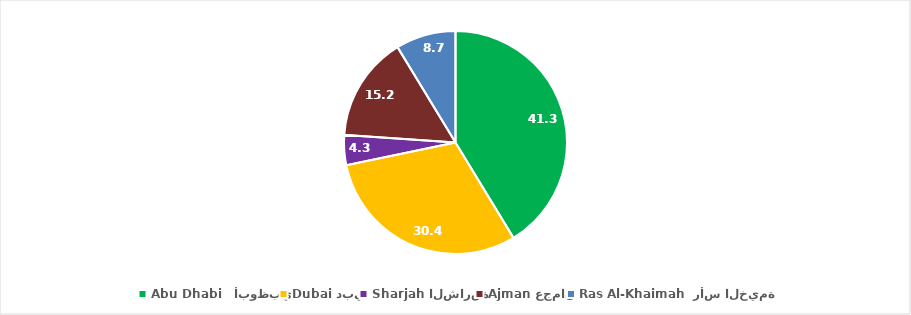
| Category | Series 0 |
|---|---|
| 0 | 41.304 |
| 1 | 30.435 |
| 2 | 4.348 |
| 3 | 15.217 |
| 4 | 8.696 |